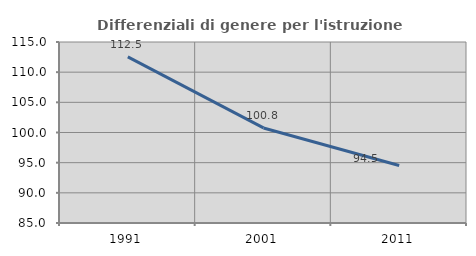
| Category | Differenziali di genere per l'istruzione superiore |
|---|---|
| 1991.0 | 112.524 |
| 2001.0 | 100.757 |
| 2011.0 | 94.541 |